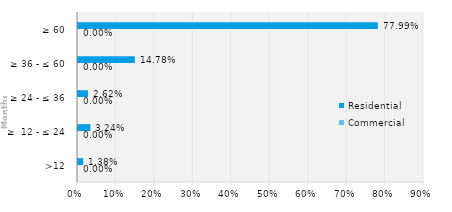
| Category | Commercial | Residential |
|---|---|---|
| >12 | 0 | 0.014 |
| ≥  12 - ≤ 24 | 0 | 0.032 |
| ≥ 24 - ≤ 36 | 0 | 0.026 |
| ≥ 36 - ≤ 60 | 0 | 0.148 |
| ≥ 60 | 0 | 0.78 |